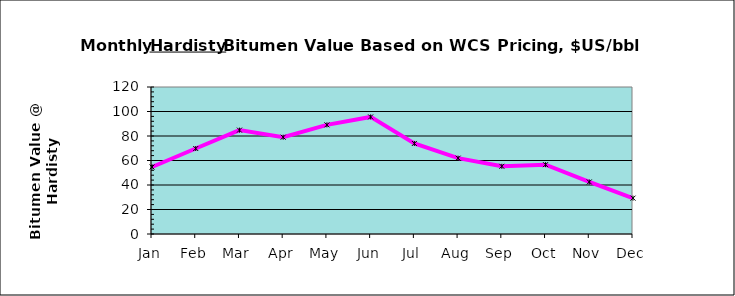
| Category |  Bitumen @ Hardisty |
|---|---|
| Jan | 54.68 |
| Feb | 69.78 |
| Mar | 84.8 |
| Apr | 79.02 |
| May | 89.09 |
| Jun | 95.58 |
| Jul | 73.91 |
| Aug | 61.91 |
| Sep | 55.27 |
| Oct | 56.6 |
| Nov | 42.5 |
| Dec | 29.28 |